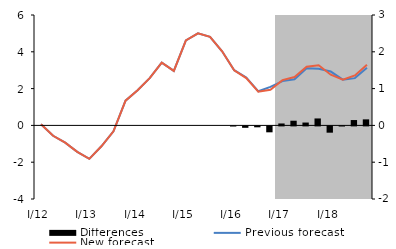
| Category | Differences |
|---|---|
| I/12 | 0 |
| II | 0 |
| III | 0 |
| IV | 0 |
| I/13 | 0 |
| II | 0 |
| III | 0 |
| IV | 0 |
| I/14 | 0 |
| II | 0 |
| III | 0 |
| IV | 0 |
| I/15 | 0 |
| II | 0 |
| III | 0 |
| IV | 0 |
| I/16 | -0.004 |
| II | -0.038 |
| III | -0.025 |
| IV | -0.161 |
| I/17 | 0.052 |
| II | 0.127 |
| III | 0.078 |
| IV | 0.189 |
| I/18 | -0.171 |
| II | -0.003 |
| III | 0.146 |
| IV | 0.164 |